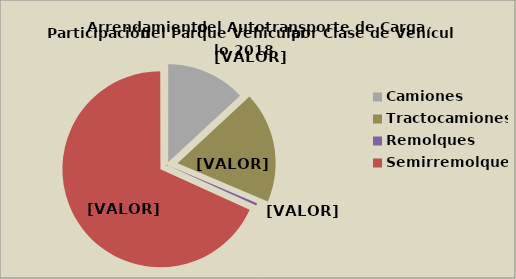
| Category | Series 0 |
|---|---|
| Camiones | 13.102 |
| Tractocamiones | 18.3 |
| Remolques | 0.387 |
| Semirremolques | 68.236 |
| Otros | 0.028 |